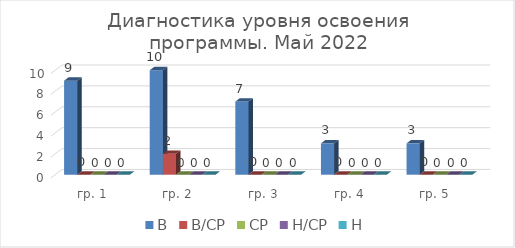
| Category | В | В/СР | СР | Н/СР | Н |
|---|---|---|---|---|---|
| гр. 1 | 9 | 0 | 0 | 0 | 0 |
| гр. 2 | 10 | 2 | 0 | 0 | 0 |
| гр. 3 | 7 | 0 | 0 | 0 | 0 |
| гр. 4 | 3 | 0 | 0 | 0 | 0 |
| гр. 5 | 3 | 0 | 0 | 0 | 0 |